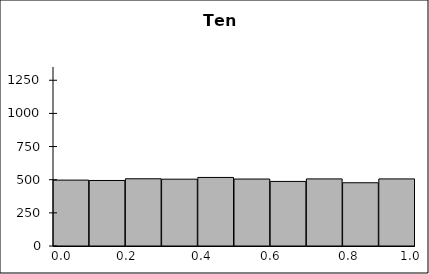
| Category | Series 1 |
|---|---|
| 0 | 497 |
| 1 | 494 |
| 2 | 507 |
| 3 | 504 |
| 4 | 517 |
| 5 | 505 |
| 6 | 487 |
| 7 | 506 |
| 8 | 477 |
| 9 | 506 |